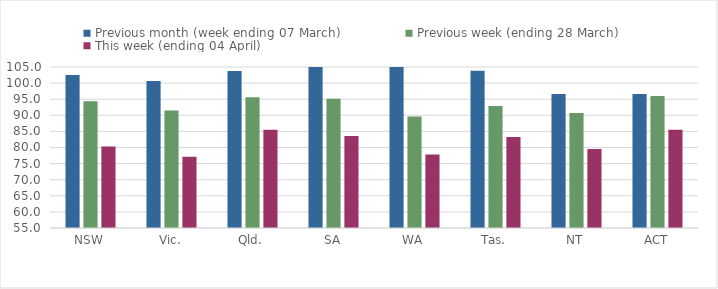
| Category | Previous month (week ending 07 March) | Previous week (ending 28 March) | This week (ending 04 April) |
|---|---|---|---|
| NSW | 102.537 | 94.399 | 80.323 |
| Vic. | 100.685 | 91.514 | 77.109 |
| Qld. | 103.791 | 95.628 | 85.543 |
| SA | 106.302 | 95.171 | 83.549 |
| WA | 113.606 | 89.636 | 77.798 |
| Tas. | 103.802 | 92.915 | 83.237 |
| NT | 96.605 | 90.703 | 79.547 |
| ACT | 96.637 | 95.988 | 85.546 |